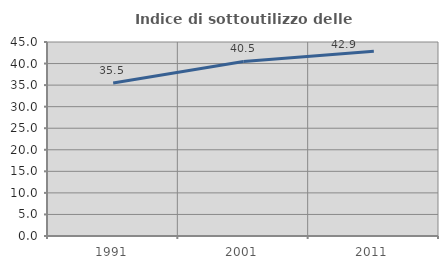
| Category | Indice di sottoutilizzo delle abitazioni  |
|---|---|
| 1991.0 | 35.507 |
| 2001.0 | 40.491 |
| 2011.0 | 42.857 |